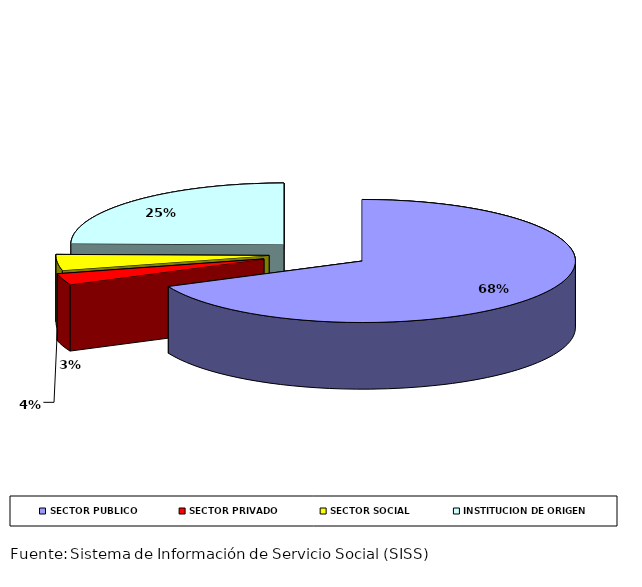
| Category | Series 0 |
|---|---|
| SECTOR PUBLICO | 1188 |
| SECTOR PRIVADO | 51 |
| SECTOR SOCIAL | 72 |
| INSTITUCIÓN DE ORIGEN | 431 |